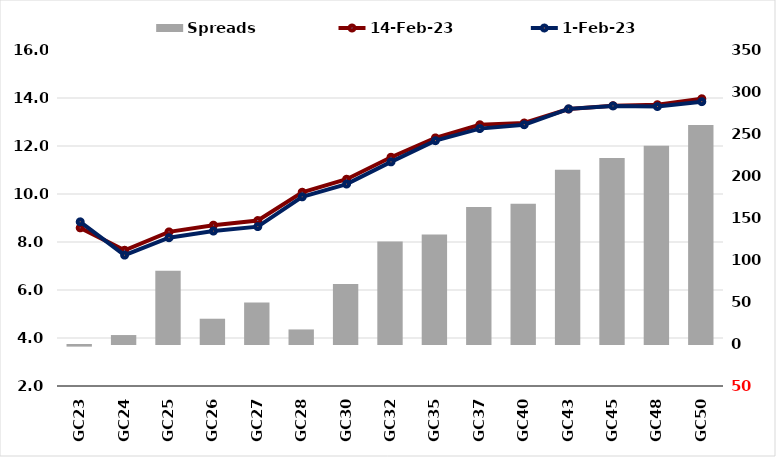
| Category |  Spreads   |
|---|---|
| GC23 | -1.929 |
| GC24 | 10.658 |
| GC25 | 87.186 |
| GC26 | 30.096 |
| GC27 | 49.461 |
| GC28 | 17.333 |
| GC30 | 71.53 |
| GC32 | 122.082 |
| GC35 | 130.28 |
| GC37 | 162.982 |
| GC40 | 166.876 |
| GC43 | 207.466 |
| GC45 | 221.527 |
| GC48 | 236.024 |
| GC50 | 260.742 |